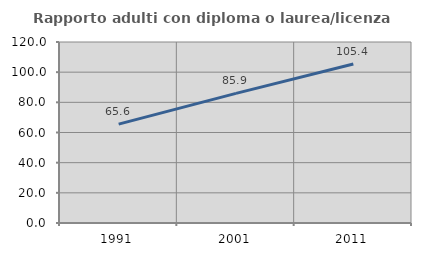
| Category | Rapporto adulti con diploma o laurea/licenza media  |
|---|---|
| 1991.0 | 65.582 |
| 2001.0 | 85.933 |
| 2011.0 | 105.391 |